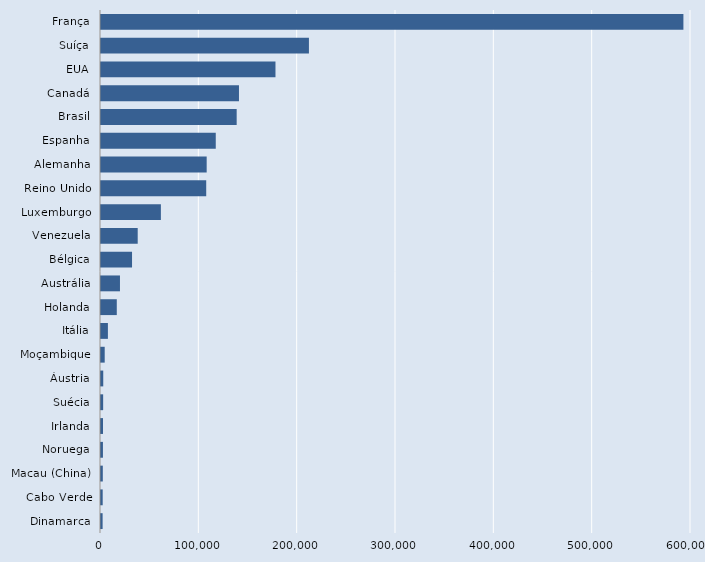
| Category | Series 0 |
|---|---|
| Dinamarca | 1640 |
| Cabo Verde | 1716 |
| Macau (China) | 1835 |
| Noruega | 1967 |
| Irlanda | 2033 |
| Suécia | 2193 |
| Áustria | 2288 |
| Moçambique | 3767 |
| Itália | 7023 |
| Holanda | 16054 |
| Austrália | 19290 |
| Bélgica | 31564 |
| Venezuela | 37326 |
| Luxemburgo | 60897 |
| Reino Unido | 107000 |
| Alemanha | 107470 |
| Espanha | 116710 |
| Brasil | 137973 |
| Canadá | 140310 |
| EUA | 177431 |
| Suíça | 211451 |
| França | 592281 |